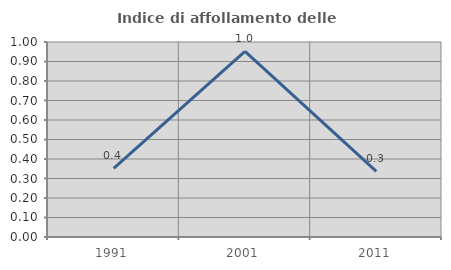
| Category | Indice di affollamento delle abitazioni  |
|---|---|
| 1991.0 | 0.351 |
| 2001.0 | 0.952 |
| 2011.0 | 0.336 |